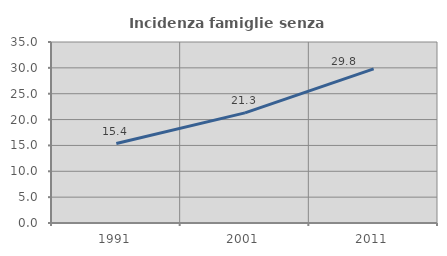
| Category | Incidenza famiglie senza nuclei |
|---|---|
| 1991.0 | 15.362 |
| 2001.0 | 21.3 |
| 2011.0 | 29.801 |